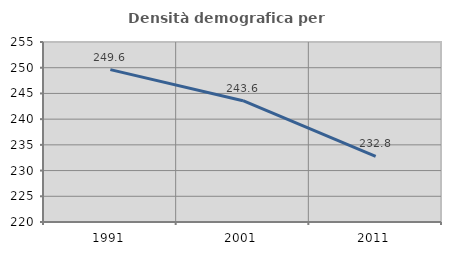
| Category | Densità demografica |
|---|---|
| 1991.0 | 249.625 |
| 2001.0 | 243.588 |
| 2011.0 | 232.751 |